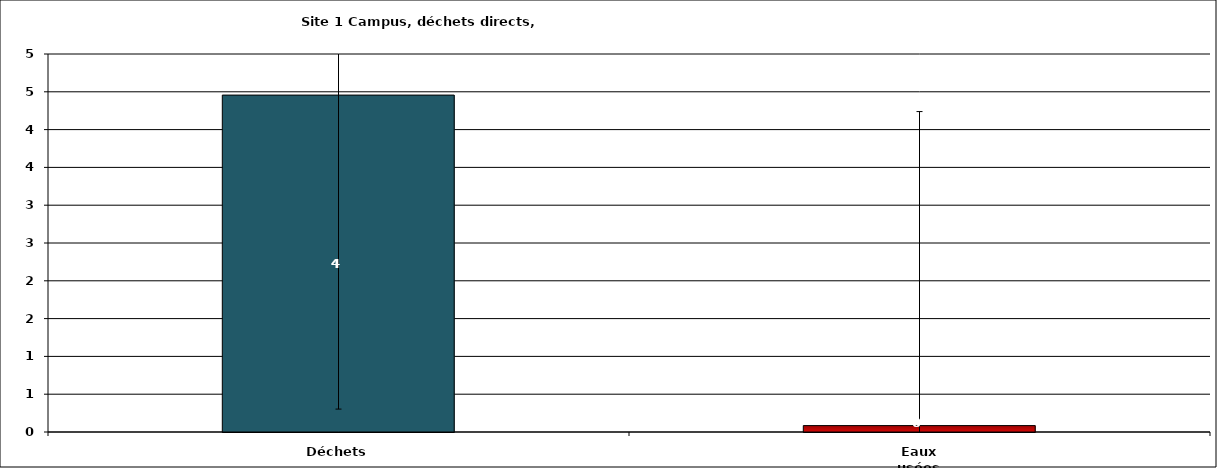
| Category | Series 0 |
|---|---|
| Déchets | 4.457 |
| Eaux usées | 0.085 |